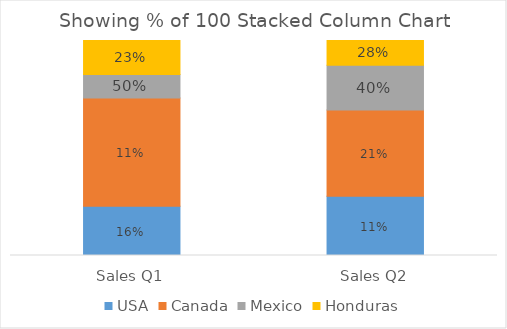
| Category | USA | Canada | Mexico | Honduras |
|---|---|---|---|---|
| Sales Q1 | 500 | 1100 | 240 | 345 |
| Sales Q2 | 600 | 875 | 456 | 250 |